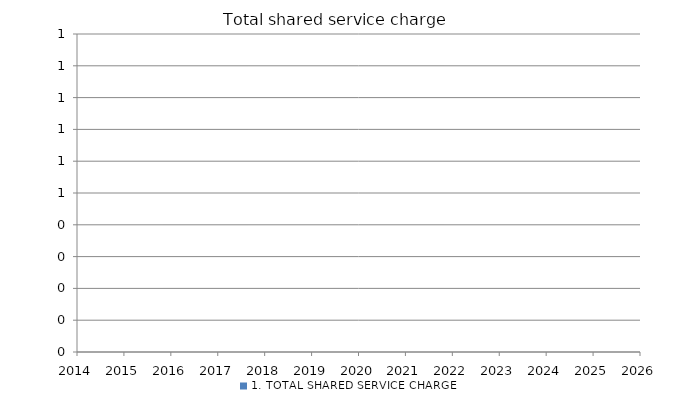
| Category | 1. TOTAL SHARED SERVICE CHARGE |
|---|---|
| 2014.0 | 0 |
| 2015.0 | 0 |
| 2016.0 | 0 |
| 2017.0 | 0 |
| 2018.0 | 0 |
| 2019.0 | 0 |
| 2020.0 | 0 |
| 2021.0 | 0 |
| 2022.0 | 0 |
| 2023.0 | 0 |
| 2024.0 | 0 |
| 2025.0 | 0 |
| 2026.0 | 0 |